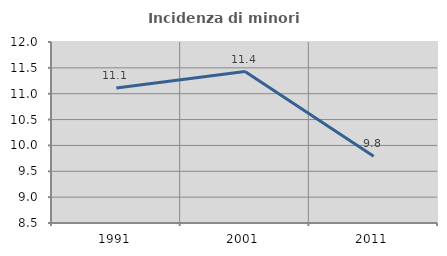
| Category | Incidenza di minori stranieri |
|---|---|
| 1991.0 | 11.111 |
| 2001.0 | 11.429 |
| 2011.0 | 9.79 |